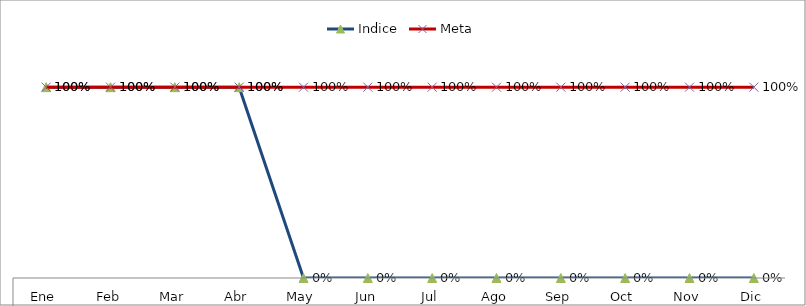
| Category | Indice | Meta |
|---|---|---|
| 0 | 1 | 1 |
| 1 | 1 | 1 |
| 2 | 1 | 1 |
| 3 | 1 | 1 |
| 4 | 0 | 1 |
| 5 | 0 | 1 |
| 6 | 0 | 1 |
| 7 | 0 | 1 |
| 8 | 0 | 1 |
| 9 | 0 | 1 |
| 10 | 0 | 1 |
| 11 | 0 | 1 |